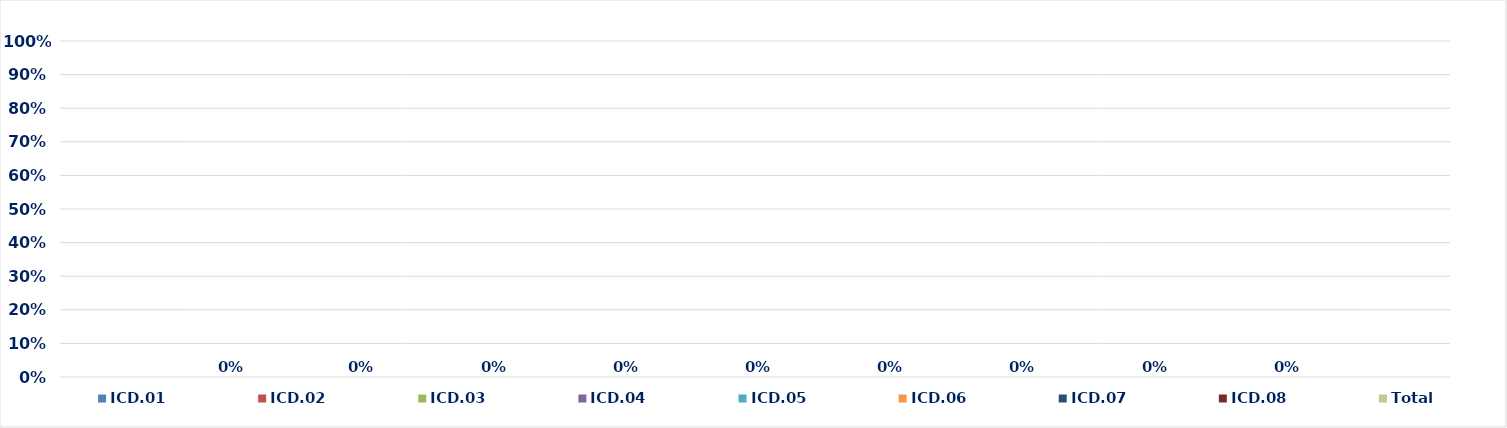
| Category | ICD.01 | ICD.02 | ICD.03 | ICD.04 | ICD.05 | ICD.06 | ICD.07 | ICD.08 | Total |
|---|---|---|---|---|---|---|---|---|---|
| 0 | 0 | 0 | 0 | 0 | 0 | 0 | 0 | 0 | 0 |